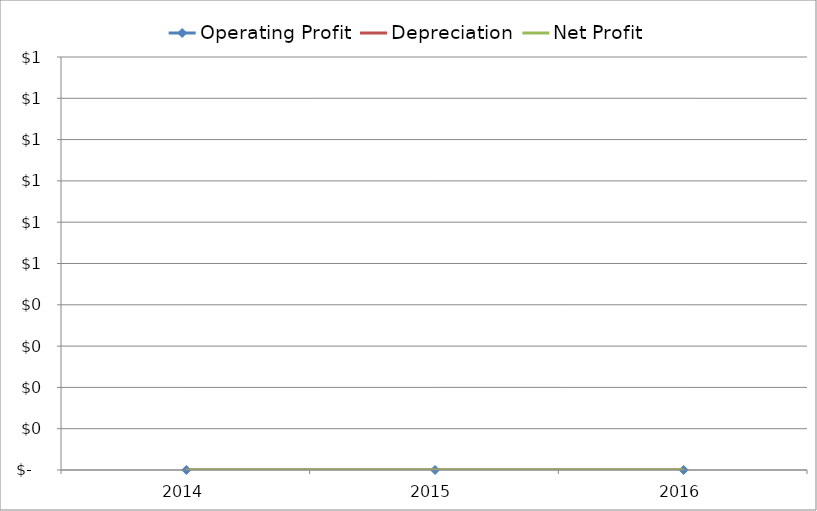
| Category | Operating Profit | Depreciation | Net Profit |
|---|---|---|---|
| 2014 | 0 | 0 | 0 |
| 2015 | 0 | 0 | 0 |
| 2016 | 0 | 0 | 0 |